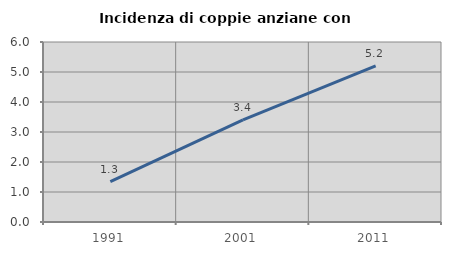
| Category | Incidenza di coppie anziane con figli |
|---|---|
| 1991.0 | 1.342 |
| 2001.0 | 3.407 |
| 2011.0 | 5.202 |